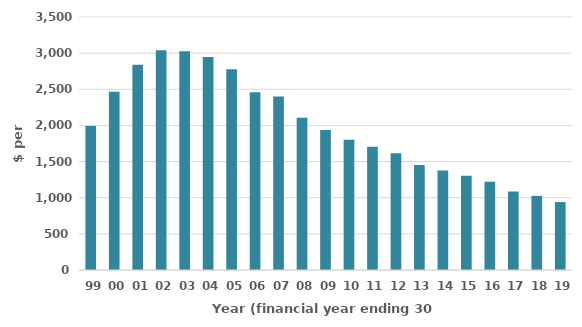
| Category | NGR per adult ($)a, c |
|---|---|
| 99 | 1991.346 |
| 00 | 2466.196 |
| 01 | 2839.421 |
| 02 | 3041.64 |
| 03 | 3027.727 |
| 04 | 2947.612 |
| 05 | 2776.901 |
| 06 | 2459.957 |
| 07 | 2398.897 |
| 08 | 2105.222 |
| 09 | 1935.319 |
| 10 | 1801.88 |
| 11 | 1705.551 |
| 12 | 1616.79 |
| 13 | 1454.256 |
| 14 | 1376.283 |
| 15 | 1302.886 |
| 16 | 1219.276 |
| 17 | 1085.642 |
| 18 | 1024.885 |
| 19 | 939.626 |